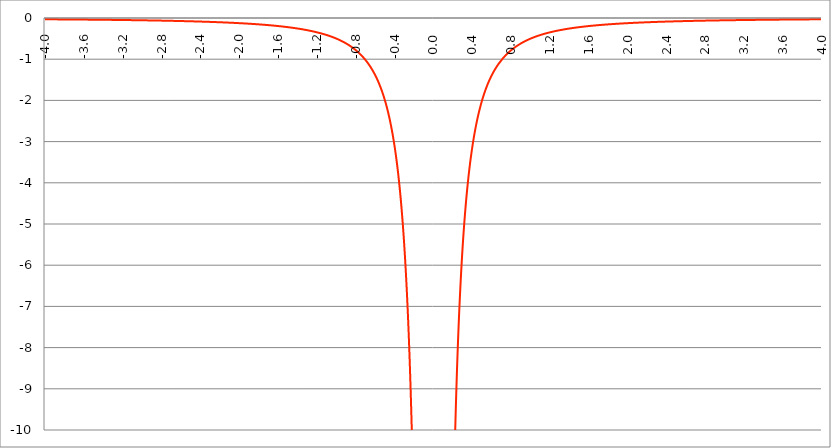
| Category | Series 1 |
|---|---|
| -4.0 | -0.031 |
| -3.996 | -0.031 |
| -3.992 | -0.031 |
| -3.988 | -0.031 |
| -3.984 | -0.032 |
| -3.98 | -0.032 |
| -3.976 | -0.032 |
| -3.972 | -0.032 |
| -3.968 | -0.032 |
| -3.964 | -0.032 |
| -3.96 | -0.032 |
| -3.956 | -0.032 |
| -3.952 | -0.032 |
| -3.948 | -0.032 |
| -3.944 | -0.032 |
| -3.94 | -0.032 |
| -3.936 | -0.032 |
| -3.932 | -0.032 |
| -3.928 | -0.032 |
| -3.924 | -0.032 |
| -3.92 | -0.033 |
| -3.916 | -0.033 |
| -3.912 | -0.033 |
| -3.908 | -0.033 |
| -3.904 | -0.033 |
| -3.9 | -0.033 |
| -3.896 | -0.033 |
| -3.892 | -0.033 |
| -3.888 | -0.033 |
| -3.884 | -0.033 |
| -3.88 | -0.033 |
| -3.876 | -0.033 |
| -3.872 | -0.033 |
| -3.868 | -0.033 |
| -3.864 | -0.033 |
| -3.86 | -0.034 |
| -3.856 | -0.034 |
| -3.852 | -0.034 |
| -3.848 | -0.034 |
| -3.844 | -0.034 |
| -3.84 | -0.034 |
| -3.836 | -0.034 |
| -3.832 | -0.034 |
| -3.828 | -0.034 |
| -3.824 | -0.034 |
| -3.82 | -0.034 |
| -3.816 | -0.034 |
| -3.812 | -0.034 |
| -3.808 | -0.034 |
| -3.804 | -0.035 |
| -3.8 | -0.035 |
| -3.796 | -0.035 |
| -3.792 | -0.035 |
| -3.788 | -0.035 |
| -3.784 | -0.035 |
| -3.78 | -0.035 |
| -3.776 | -0.035 |
| -3.772 | -0.035 |
| -3.768 | -0.035 |
| -3.764 | -0.035 |
| -3.76 | -0.035 |
| -3.756 | -0.035 |
| -3.752 | -0.036 |
| -3.748 | -0.036 |
| -3.744 | -0.036 |
| -3.74 | -0.036 |
| -3.736 | -0.036 |
| -3.732 | -0.036 |
| -3.728 | -0.036 |
| -3.724 | -0.036 |
| -3.72 | -0.036 |
| -3.716 | -0.036 |
| -3.712 | -0.036 |
| -3.708 | -0.036 |
| -3.704 | -0.036 |
| -3.7 | -0.037 |
| -3.696 | -0.037 |
| -3.692 | -0.037 |
| -3.688 | -0.037 |
| -3.684 | -0.037 |
| -3.68 | -0.037 |
| -3.676 | -0.037 |
| -3.672 | -0.037 |
| -3.668 | -0.037 |
| -3.664 | -0.037 |
| -3.66 | -0.037 |
| -3.656 | -0.037 |
| -3.652 | -0.037 |
| -3.648 | -0.038 |
| -3.644 | -0.038 |
| -3.64 | -0.038 |
| -3.636 | -0.038 |
| -3.632 | -0.038 |
| -3.628 | -0.038 |
| -3.624 | -0.038 |
| -3.62 | -0.038 |
| -3.616 | -0.038 |
| -3.612 | -0.038 |
| -3.608 | -0.038 |
| -3.604 | -0.038 |
| -3.6 | -0.039 |
| -3.596 | -0.039 |
| -3.592 | -0.039 |
| -3.588 | -0.039 |
| -3.584 | -0.039 |
| -3.58 | -0.039 |
| -3.576 | -0.039 |
| -3.572 | -0.039 |
| -3.568 | -0.039 |
| -3.564 | -0.039 |
| -3.56 | -0.039 |
| -3.556 | -0.04 |
| -3.552 | -0.04 |
| -3.548 | -0.04 |
| -3.544 | -0.04 |
| -3.54 | -0.04 |
| -3.536 | -0.04 |
| -3.532 | -0.04 |
| -3.528 | -0.04 |
| -3.524 | -0.04 |
| -3.52 | -0.04 |
| -3.516 | -0.04 |
| -3.512 | -0.041 |
| -3.508 | -0.041 |
| -3.504 | -0.041 |
| -3.5 | -0.041 |
| -3.496 | -0.041 |
| -3.492 | -0.041 |
| -3.488 | -0.041 |
| -3.484 | -0.041 |
| -3.48 | -0.041 |
| -3.476 | -0.041 |
| -3.472 | -0.041 |
| -3.467999999999999 | -0.042 |
| -3.463999999999999 | -0.042 |
| -3.459999999999999 | -0.042 |
| -3.455999999999999 | -0.042 |
| -3.451999999999999 | -0.042 |
| -3.447999999999999 | -0.042 |
| -3.443999999999999 | -0.042 |
| -3.439999999999999 | -0.042 |
| -3.435999999999999 | -0.042 |
| -3.431999999999999 | -0.042 |
| -3.427999999999999 | -0.043 |
| -3.423999999999999 | -0.043 |
| -3.419999999999999 | -0.043 |
| -3.415999999999999 | -0.043 |
| -3.411999999999999 | -0.043 |
| -3.407999999999999 | -0.043 |
| -3.403999999999999 | -0.043 |
| -3.399999999999999 | -0.043 |
| -3.395999999999999 | -0.043 |
| -3.391999999999999 | -0.043 |
| -3.387999999999999 | -0.044 |
| -3.383999999999999 | -0.044 |
| -3.379999999999999 | -0.044 |
| -3.375999999999999 | -0.044 |
| -3.371999999999999 | -0.044 |
| -3.367999999999999 | -0.044 |
| -3.363999999999999 | -0.044 |
| -3.359999999999999 | -0.044 |
| -3.355999999999999 | -0.044 |
| -3.351999999999999 | -0.045 |
| -3.347999999999999 | -0.045 |
| -3.343999999999999 | -0.045 |
| -3.339999999999999 | -0.045 |
| -3.335999999999999 | -0.045 |
| -3.331999999999999 | -0.045 |
| -3.327999999999999 | -0.045 |
| -3.323999999999999 | -0.045 |
| -3.319999999999999 | -0.045 |
| -3.315999999999999 | -0.045 |
| -3.311999999999999 | -0.046 |
| -3.307999999999999 | -0.046 |
| -3.303999999999999 | -0.046 |
| -3.299999999999999 | -0.046 |
| -3.295999999999999 | -0.046 |
| -3.291999999999999 | -0.046 |
| -3.288 | -0.046 |
| -3.284 | -0.046 |
| -3.279999999999999 | -0.046 |
| -3.275999999999999 | -0.047 |
| -3.271999999999999 | -0.047 |
| -3.268 | -0.047 |
| -3.264 | -0.047 |
| -3.259999999999999 | -0.047 |
| -3.255999999999999 | -0.047 |
| -3.251999999999999 | -0.047 |
| -3.248 | -0.047 |
| -3.244 | -0.048 |
| -3.239999999999999 | -0.048 |
| -3.235999999999999 | -0.048 |
| -3.231999999999999 | -0.048 |
| -3.228 | -0.048 |
| -3.224 | -0.048 |
| -3.219999999999999 | -0.048 |
| -3.215999999999999 | -0.048 |
| -3.211999999999999 | -0.048 |
| -3.208 | -0.049 |
| -3.204 | -0.049 |
| -3.199999999999999 | -0.049 |
| -3.195999999999999 | -0.049 |
| -3.191999999999999 | -0.049 |
| -3.188 | -0.049 |
| -3.184 | -0.049 |
| -3.179999999999999 | -0.049 |
| -3.175999999999999 | -0.05 |
| -3.171999999999999 | -0.05 |
| -3.168 | -0.05 |
| -3.164 | -0.05 |
| -3.159999999999999 | -0.05 |
| -3.155999999999999 | -0.05 |
| -3.151999999999999 | -0.05 |
| -3.148 | -0.05 |
| -3.144 | -0.051 |
| -3.139999999999999 | -0.051 |
| -3.135999999999999 | -0.051 |
| -3.131999999999999 | -0.051 |
| -3.128 | -0.051 |
| -3.124 | -0.051 |
| -3.119999999999999 | -0.051 |
| -3.115999999999999 | -0.051 |
| -3.111999999999999 | -0.052 |
| -3.108 | -0.052 |
| -3.104 | -0.052 |
| -3.099999999999999 | -0.052 |
| -3.095999999999999 | -0.052 |
| -3.091999999999999 | -0.052 |
| -3.088 | -0.052 |
| -3.084 | -0.053 |
| -3.079999999999999 | -0.053 |
| -3.075999999999999 | -0.053 |
| -3.071999999999999 | -0.053 |
| -3.068 | -0.053 |
| -3.064 | -0.053 |
| -3.059999999999999 | -0.053 |
| -3.055999999999999 | -0.054 |
| -3.051999999999999 | -0.054 |
| -3.048 | -0.054 |
| -3.044 | -0.054 |
| -3.039999999999999 | -0.054 |
| -3.035999999999999 | -0.054 |
| -3.031999999999999 | -0.054 |
| -3.028 | -0.055 |
| -3.024 | -0.055 |
| -3.019999999999999 | -0.055 |
| -3.015999999999999 | -0.055 |
| -3.011999999999999 | -0.055 |
| -3.008 | -0.055 |
| -3.004 | -0.055 |
| -2.999999999999999 | -0.056 |
| -2.995999999999999 | -0.056 |
| -2.991999999999999 | -0.056 |
| -2.988 | -0.056 |
| -2.984 | -0.056 |
| -2.979999999999999 | -0.056 |
| -2.975999999999999 | -0.056 |
| -2.971999999999999 | -0.057 |
| -2.968 | -0.057 |
| -2.964 | -0.057 |
| -2.959999999999999 | -0.057 |
| -2.955999999999999 | -0.057 |
| -2.951999999999999 | -0.057 |
| -2.948 | -0.058 |
| -2.944 | -0.058 |
| -2.939999999999999 | -0.058 |
| -2.935999999999999 | -0.058 |
| -2.931999999999999 | -0.058 |
| -2.928 | -0.058 |
| -2.924 | -0.058 |
| -2.919999999999999 | -0.059 |
| -2.915999999999999 | -0.059 |
| -2.911999999999999 | -0.059 |
| -2.908 | -0.059 |
| -2.904 | -0.059 |
| -2.899999999999999 | -0.059 |
| -2.895999999999999 | -0.06 |
| -2.891999999999999 | -0.06 |
| -2.887999999999999 | -0.06 |
| -2.883999999999999 | -0.06 |
| -2.879999999999999 | -0.06 |
| -2.875999999999999 | -0.06 |
| -2.871999999999999 | -0.061 |
| -2.867999999999999 | -0.061 |
| -2.863999999999999 | -0.061 |
| -2.859999999999999 | -0.061 |
| -2.855999999999999 | -0.061 |
| -2.851999999999999 | -0.061 |
| -2.847999999999999 | -0.062 |
| -2.843999999999999 | -0.062 |
| -2.839999999999999 | -0.062 |
| -2.835999999999999 | -0.062 |
| -2.831999999999999 | -0.062 |
| -2.827999999999999 | -0.063 |
| -2.823999999999999 | -0.063 |
| -2.819999999999999 | -0.063 |
| -2.815999999999999 | -0.063 |
| -2.811999999999999 | -0.063 |
| -2.807999999999999 | -0.063 |
| -2.803999999999999 | -0.064 |
| -2.799999999999999 | -0.064 |
| -2.795999999999999 | -0.064 |
| -2.791999999999999 | -0.064 |
| -2.787999999999999 | -0.064 |
| -2.783999999999999 | -0.065 |
| -2.779999999999999 | -0.065 |
| -2.775999999999999 | -0.065 |
| -2.771999999999999 | -0.065 |
| -2.767999999999999 | -0.065 |
| -2.763999999999999 | -0.065 |
| -2.759999999999999 | -0.066 |
| -2.755999999999999 | -0.066 |
| -2.751999999999999 | -0.066 |
| -2.747999999999999 | -0.066 |
| -2.743999999999999 | -0.066 |
| -2.739999999999999 | -0.067 |
| -2.735999999999999 | -0.067 |
| -2.731999999999999 | -0.067 |
| -2.727999999999999 | -0.067 |
| -2.723999999999999 | -0.067 |
| -2.719999999999999 | -0.068 |
| -2.715999999999999 | -0.068 |
| -2.711999999999999 | -0.068 |
| -2.707999999999999 | -0.068 |
| -2.703999999999999 | -0.068 |
| -2.699999999999999 | -0.069 |
| -2.695999999999999 | -0.069 |
| -2.691999999999999 | -0.069 |
| -2.687999999999999 | -0.069 |
| -2.683999999999999 | -0.069 |
| -2.679999999999999 | -0.07 |
| -2.675999999999999 | -0.07 |
| -2.671999999999999 | -0.07 |
| -2.667999999999999 | -0.07 |
| -2.663999999999999 | -0.07 |
| -2.659999999999999 | -0.071 |
| -2.655999999999999 | -0.071 |
| -2.651999999999999 | -0.071 |
| -2.647999999999999 | -0.071 |
| -2.643999999999999 | -0.072 |
| -2.639999999999999 | -0.072 |
| -2.635999999999999 | -0.072 |
| -2.631999999999999 | -0.072 |
| -2.627999999999999 | -0.072 |
| -2.623999999999999 | -0.073 |
| -2.619999999999999 | -0.073 |
| -2.615999999999999 | -0.073 |
| -2.611999999999999 | -0.073 |
| -2.607999999999999 | -0.074 |
| -2.603999999999999 | -0.074 |
| -2.599999999999999 | -0.074 |
| -2.595999999999999 | -0.074 |
| -2.591999999999999 | -0.074 |
| -2.587999999999999 | -0.075 |
| -2.583999999999999 | -0.075 |
| -2.579999999999999 | -0.075 |
| -2.575999999999999 | -0.075 |
| -2.571999999999999 | -0.076 |
| -2.567999999999999 | -0.076 |
| -2.563999999999999 | -0.076 |
| -2.559999999999999 | -0.076 |
| -2.555999999999999 | -0.077 |
| -2.551999999999999 | -0.077 |
| -2.547999999999999 | -0.077 |
| -2.543999999999999 | -0.077 |
| -2.539999999999999 | -0.078 |
| -2.535999999999999 | -0.078 |
| -2.531999999999999 | -0.078 |
| -2.527999999999999 | -0.078 |
| -2.523999999999999 | -0.078 |
| -2.519999999999999 | -0.079 |
| -2.515999999999999 | -0.079 |
| -2.511999999999999 | -0.079 |
| -2.507999999999999 | -0.079 |
| -2.503999999999999 | -0.08 |
| -2.499999999999999 | -0.08 |
| -2.495999999999999 | -0.08 |
| -2.491999999999999 | -0.081 |
| -2.487999999999999 | -0.081 |
| -2.483999999999999 | -0.081 |
| -2.479999999999999 | -0.081 |
| -2.475999999999999 | -0.082 |
| -2.471999999999999 | -0.082 |
| -2.467999999999999 | -0.082 |
| -2.463999999999999 | -0.082 |
| -2.459999999999999 | -0.083 |
| -2.455999999999999 | -0.083 |
| -2.451999999999999 | -0.083 |
| -2.447999999999999 | -0.083 |
| -2.443999999999999 | -0.084 |
| -2.439999999999999 | -0.084 |
| -2.435999999999999 | -0.084 |
| -2.431999999999999 | -0.085 |
| -2.427999999999999 | -0.085 |
| -2.423999999999999 | -0.085 |
| -2.419999999999999 | -0.085 |
| -2.415999999999999 | -0.086 |
| -2.411999999999999 | -0.086 |
| -2.407999999999999 | -0.086 |
| -2.403999999999999 | -0.087 |
| -2.399999999999999 | -0.087 |
| -2.395999999999999 | -0.087 |
| -2.391999999999999 | -0.087 |
| -2.387999999999999 | -0.088 |
| -2.383999999999999 | -0.088 |
| -2.379999999999999 | -0.088 |
| -2.375999999999999 | -0.089 |
| -2.371999999999999 | -0.089 |
| -2.367999999999998 | -0.089 |
| -2.363999999999998 | -0.089 |
| -2.359999999999998 | -0.09 |
| -2.355999999999998 | -0.09 |
| -2.351999999999998 | -0.09 |
| -2.347999999999998 | -0.091 |
| -2.343999999999998 | -0.091 |
| -2.339999999999998 | -0.091 |
| -2.335999999999998 | -0.092 |
| -2.331999999999998 | -0.092 |
| -2.327999999999998 | -0.092 |
| -2.323999999999998 | -0.093 |
| -2.319999999999998 | -0.093 |
| -2.315999999999998 | -0.093 |
| -2.311999999999998 | -0.094 |
| -2.307999999999998 | -0.094 |
| -2.303999999999998 | -0.094 |
| -2.299999999999998 | -0.095 |
| -2.295999999999998 | -0.095 |
| -2.291999999999998 | -0.095 |
| -2.287999999999998 | -0.096 |
| -2.283999999999998 | -0.096 |
| -2.279999999999998 | -0.096 |
| -2.275999999999998 | -0.097 |
| -2.271999999999998 | -0.097 |
| -2.267999999999998 | -0.097 |
| -2.263999999999998 | -0.098 |
| -2.259999999999998 | -0.098 |
| -2.255999999999998 | -0.098 |
| -2.251999999999998 | -0.099 |
| -2.247999999999998 | -0.099 |
| -2.243999999999998 | -0.099 |
| -2.239999999999998 | -0.1 |
| -2.235999999999998 | -0.1 |
| -2.231999999999998 | -0.1 |
| -2.227999999999998 | -0.101 |
| -2.223999999999998 | -0.101 |
| -2.219999999999998 | -0.101 |
| -2.215999999999998 | -0.102 |
| -2.211999999999998 | -0.102 |
| -2.207999999999998 | -0.103 |
| -2.203999999999998 | -0.103 |
| -2.199999999999998 | -0.103 |
| -2.195999999999998 | -0.104 |
| -2.191999999999998 | -0.104 |
| -2.187999999999998 | -0.104 |
| -2.183999999999998 | -0.105 |
| -2.179999999999998 | -0.105 |
| -2.175999999999998 | -0.106 |
| -2.171999999999998 | -0.106 |
| -2.167999999999998 | -0.106 |
| -2.163999999999998 | -0.107 |
| -2.159999999999998 | -0.107 |
| -2.155999999999998 | -0.108 |
| -2.151999999999998 | -0.108 |
| -2.147999999999998 | -0.108 |
| -2.143999999999998 | -0.109 |
| -2.139999999999998 | -0.109 |
| -2.135999999999998 | -0.11 |
| -2.131999999999998 | -0.11 |
| -2.127999999999998 | -0.11 |
| -2.123999999999998 | -0.111 |
| -2.119999999999998 | -0.111 |
| -2.115999999999998 | -0.112 |
| -2.111999999999998 | -0.112 |
| -2.107999999999998 | -0.113 |
| -2.103999999999998 | -0.113 |
| -2.099999999999998 | -0.113 |
| -2.095999999999998 | -0.114 |
| -2.091999999999998 | -0.114 |
| -2.087999999999998 | -0.115 |
| -2.083999999999998 | -0.115 |
| -2.079999999999998 | -0.116 |
| -2.075999999999998 | -0.116 |
| -2.071999999999998 | -0.116 |
| -2.067999999999998 | -0.117 |
| -2.063999999999998 | -0.117 |
| -2.059999999999998 | -0.118 |
| -2.055999999999998 | -0.118 |
| -2.051999999999998 | -0.119 |
| -2.047999999999998 | -0.119 |
| -2.043999999999998 | -0.12 |
| -2.039999999999998 | -0.12 |
| -2.035999999999998 | -0.121 |
| -2.031999999999998 | -0.121 |
| -2.027999999999998 | -0.122 |
| -2.023999999999998 | -0.122 |
| -2.019999999999998 | -0.123 |
| -2.015999999999998 | -0.123 |
| -2.011999999999998 | -0.124 |
| -2.007999999999998 | -0.124 |
| -2.003999999999998 | -0.125 |
| -1.999999999999998 | -0.125 |
| -1.995999999999998 | -0.126 |
| -1.991999999999998 | -0.126 |
| -1.987999999999998 | -0.127 |
| -1.983999999999998 | -0.127 |
| -1.979999999999998 | -0.128 |
| -1.975999999999998 | -0.128 |
| -1.971999999999998 | -0.129 |
| -1.967999999999998 | -0.129 |
| -1.963999999999998 | -0.13 |
| -1.959999999999998 | -0.13 |
| -1.955999999999998 | -0.131 |
| -1.951999999999998 | -0.131 |
| -1.947999999999998 | -0.132 |
| -1.943999999999998 | -0.132 |
| -1.939999999999998 | -0.133 |
| -1.935999999999998 | -0.133 |
| -1.931999999999998 | -0.134 |
| -1.927999999999998 | -0.135 |
| -1.923999999999998 | -0.135 |
| -1.919999999999998 | -0.136 |
| -1.915999999999998 | -0.136 |
| -1.911999999999998 | -0.137 |
| -1.907999999999998 | -0.137 |
| -1.903999999999998 | -0.138 |
| -1.899999999999998 | -0.139 |
| -1.895999999999998 | -0.139 |
| -1.891999999999998 | -0.14 |
| -1.887999999999998 | -0.14 |
| -1.883999999999998 | -0.141 |
| -1.879999999999998 | -0.141 |
| -1.875999999999998 | -0.142 |
| -1.871999999999998 | -0.143 |
| -1.867999999999998 | -0.143 |
| -1.863999999999998 | -0.144 |
| -1.859999999999998 | -0.145 |
| -1.855999999999998 | -0.145 |
| -1.851999999999998 | -0.146 |
| -1.847999999999998 | -0.146 |
| -1.843999999999998 | -0.147 |
| -1.839999999999998 | -0.148 |
| -1.835999999999998 | -0.148 |
| -1.831999999999998 | -0.149 |
| -1.827999999999998 | -0.15 |
| -1.823999999999998 | -0.15 |
| -1.819999999999998 | -0.151 |
| -1.815999999999998 | -0.152 |
| -1.811999999999998 | -0.152 |
| -1.807999999999998 | -0.153 |
| -1.803999999999998 | -0.154 |
| -1.799999999999998 | -0.154 |
| -1.795999999999998 | -0.155 |
| -1.791999999999998 | -0.156 |
| -1.787999999999998 | -0.156 |
| -1.783999999999998 | -0.157 |
| -1.779999999999998 | -0.158 |
| -1.775999999999998 | -0.159 |
| -1.771999999999998 | -0.159 |
| -1.767999999999998 | -0.16 |
| -1.763999999999998 | -0.161 |
| -1.759999999999998 | -0.161 |
| -1.755999999999998 | -0.162 |
| -1.751999999999998 | -0.163 |
| -1.747999999999998 | -0.164 |
| -1.743999999999998 | -0.164 |
| -1.739999999999998 | -0.165 |
| -1.735999999999998 | -0.166 |
| -1.731999999999998 | -0.167 |
| -1.727999999999998 | -0.167 |
| -1.723999999999998 | -0.168 |
| -1.719999999999998 | -0.169 |
| -1.715999999999998 | -0.17 |
| -1.711999999999998 | -0.171 |
| -1.707999999999998 | -0.171 |
| -1.703999999999998 | -0.172 |
| -1.699999999999998 | -0.173 |
| -1.695999999999998 | -0.174 |
| -1.691999999999998 | -0.175 |
| -1.687999999999998 | -0.175 |
| -1.683999999999998 | -0.176 |
| -1.679999999999998 | -0.177 |
| -1.675999999999998 | -0.178 |
| -1.671999999999998 | -0.179 |
| -1.667999999999998 | -0.18 |
| -1.663999999999998 | -0.181 |
| -1.659999999999998 | -0.181 |
| -1.655999999999998 | -0.182 |
| -1.651999999999998 | -0.183 |
| -1.647999999999998 | -0.184 |
| -1.643999999999998 | -0.185 |
| -1.639999999999998 | -0.186 |
| -1.635999999999998 | -0.187 |
| -1.631999999999998 | -0.188 |
| -1.627999999999998 | -0.189 |
| -1.623999999999998 | -0.19 |
| -1.619999999999998 | -0.191 |
| -1.615999999999998 | -0.191 |
| -1.611999999999998 | -0.192 |
| -1.607999999999998 | -0.193 |
| -1.603999999999998 | -0.194 |
| -1.599999999999998 | -0.195 |
| -1.595999999999998 | -0.196 |
| -1.591999999999998 | -0.197 |
| -1.587999999999998 | -0.198 |
| -1.583999999999998 | -0.199 |
| -1.579999999999998 | -0.2 |
| -1.575999999999998 | -0.201 |
| -1.571999999999998 | -0.202 |
| -1.567999999999998 | -0.203 |
| -1.563999999999998 | -0.204 |
| -1.559999999999998 | -0.205 |
| -1.555999999999998 | -0.207 |
| -1.551999999999998 | -0.208 |
| -1.547999999999998 | -0.209 |
| -1.543999999999998 | -0.21 |
| -1.539999999999998 | -0.211 |
| -1.535999999999998 | -0.212 |
| -1.531999999999998 | -0.213 |
| -1.527999999999998 | -0.214 |
| -1.523999999999998 | -0.215 |
| -1.519999999999998 | -0.216 |
| -1.515999999999998 | -0.218 |
| -1.511999999999998 | -0.219 |
| -1.507999999999998 | -0.22 |
| -1.503999999999998 | -0.221 |
| -1.499999999999998 | -0.222 |
| -1.495999999999998 | -0.223 |
| -1.491999999999998 | -0.225 |
| -1.487999999999998 | -0.226 |
| -1.483999999999998 | -0.227 |
| -1.479999999999998 | -0.228 |
| -1.475999999999998 | -0.23 |
| -1.471999999999998 | -0.231 |
| -1.467999999999998 | -0.232 |
| -1.463999999999998 | -0.233 |
| -1.459999999999998 | -0.235 |
| -1.455999999999998 | -0.236 |
| -1.451999999999998 | -0.237 |
| -1.447999999999998 | -0.238 |
| -1.443999999999998 | -0.24 |
| -1.439999999999998 | -0.241 |
| -1.435999999999998 | -0.242 |
| -1.431999999999998 | -0.244 |
| -1.427999999999998 | -0.245 |
| -1.423999999999998 | -0.247 |
| -1.419999999999998 | -0.248 |
| -1.415999999999998 | -0.249 |
| -1.411999999999998 | -0.251 |
| -1.407999999999998 | -0.252 |
| -1.403999999999998 | -0.254 |
| -1.399999999999998 | -0.255 |
| -1.395999999999998 | -0.257 |
| -1.391999999999998 | -0.258 |
| -1.387999999999998 | -0.26 |
| -1.383999999999998 | -0.261 |
| -1.379999999999998 | -0.263 |
| -1.375999999999998 | -0.264 |
| -1.371999999999998 | -0.266 |
| -1.367999999999998 | -0.267 |
| -1.363999999999998 | -0.269 |
| -1.359999999999998 | -0.27 |
| -1.355999999999998 | -0.272 |
| -1.351999999999998 | -0.274 |
| -1.347999999999998 | -0.275 |
| -1.343999999999998 | -0.277 |
| -1.339999999999998 | -0.278 |
| -1.335999999999998 | -0.28 |
| -1.331999999999998 | -0.282 |
| -1.327999999999998 | -0.284 |
| -1.323999999999998 | -0.285 |
| -1.319999999999998 | -0.287 |
| -1.315999999999998 | -0.289 |
| -1.311999999999998 | -0.29 |
| -1.307999999999998 | -0.292 |
| -1.303999999999998 | -0.294 |
| -1.299999999999998 | -0.296 |
| -1.295999999999998 | -0.298 |
| -1.291999999999998 | -0.3 |
| -1.287999999999998 | -0.301 |
| -1.283999999999998 | -0.303 |
| -1.279999999999998 | -0.305 |
| -1.275999999999998 | -0.307 |
| -1.271999999999998 | -0.309 |
| -1.267999999999998 | -0.311 |
| -1.263999999999998 | -0.313 |
| -1.259999999999998 | -0.315 |
| -1.255999999999998 | -0.317 |
| -1.251999999999998 | -0.319 |
| -1.247999999999998 | -0.321 |
| -1.243999999999998 | -0.323 |
| -1.239999999999998 | -0.325 |
| -1.235999999999998 | -0.327 |
| -1.231999999999998 | -0.329 |
| -1.227999999999998 | -0.332 |
| -1.223999999999998 | -0.334 |
| -1.219999999999998 | -0.336 |
| -1.215999999999998 | -0.338 |
| -1.211999999999998 | -0.34 |
| -1.207999999999998 | -0.343 |
| -1.203999999999998 | -0.345 |
| -1.199999999999997 | -0.347 |
| -1.195999999999997 | -0.35 |
| -1.191999999999997 | -0.352 |
| -1.187999999999997 | -0.354 |
| -1.183999999999997 | -0.357 |
| -1.179999999999997 | -0.359 |
| -1.175999999999997 | -0.362 |
| -1.171999999999997 | -0.364 |
| -1.167999999999997 | -0.367 |
| -1.163999999999997 | -0.369 |
| -1.159999999999997 | -0.372 |
| -1.155999999999997 | -0.374 |
| -1.151999999999997 | -0.377 |
| -1.147999999999997 | -0.379 |
| -1.143999999999997 | -0.382 |
| -1.139999999999997 | -0.385 |
| -1.135999999999997 | -0.387 |
| -1.131999999999997 | -0.39 |
| -1.127999999999997 | -0.393 |
| -1.123999999999997 | -0.396 |
| -1.119999999999997 | -0.399 |
| -1.115999999999997 | -0.401 |
| -1.111999999999997 | -0.404 |
| -1.107999999999997 | -0.407 |
| -1.103999999999997 | -0.41 |
| -1.099999999999997 | -0.413 |
| -1.095999999999997 | -0.416 |
| -1.091999999999997 | -0.419 |
| -1.087999999999997 | -0.422 |
| -1.083999999999997 | -0.426 |
| -1.079999999999997 | -0.429 |
| -1.075999999999997 | -0.432 |
| -1.071999999999997 | -0.435 |
| -1.067999999999997 | -0.438 |
| -1.063999999999997 | -0.442 |
| -1.059999999999997 | -0.445 |
| -1.055999999999997 | -0.448 |
| -1.051999999999997 | -0.452 |
| -1.047999999999997 | -0.455 |
| -1.043999999999997 | -0.459 |
| -1.039999999999997 | -0.462 |
| -1.035999999999997 | -0.466 |
| -1.031999999999997 | -0.469 |
| -1.027999999999997 | -0.473 |
| -1.023999999999997 | -0.477 |
| -1.019999999999997 | -0.481 |
| -1.015999999999997 | -0.484 |
| -1.011999999999997 | -0.488 |
| -1.007999999999997 | -0.492 |
| -1.003999999999997 | -0.496 |
| -0.999999999999997 | -0.5 |
| -0.995999999999997 | -0.504 |
| -0.991999999999997 | -0.508 |
| -0.987999999999997 | -0.512 |
| -0.983999999999997 | -0.516 |
| -0.979999999999997 | -0.521 |
| -0.975999999999997 | -0.525 |
| -0.971999999999997 | -0.529 |
| -0.967999999999997 | -0.534 |
| -0.963999999999997 | -0.538 |
| -0.959999999999997 | -0.543 |
| -0.955999999999997 | -0.547 |
| -0.951999999999997 | -0.552 |
| -0.947999999999997 | -0.556 |
| -0.943999999999997 | -0.561 |
| -0.939999999999997 | -0.566 |
| -0.935999999999997 | -0.571 |
| -0.931999999999997 | -0.576 |
| -0.927999999999997 | -0.581 |
| -0.923999999999997 | -0.586 |
| -0.919999999999997 | -0.591 |
| -0.915999999999997 | -0.596 |
| -0.911999999999997 | -0.601 |
| -0.907999999999997 | -0.606 |
| -0.903999999999997 | -0.612 |
| -0.899999999999997 | -0.617 |
| -0.895999999999997 | -0.623 |
| -0.891999999999997 | -0.628 |
| -0.887999999999997 | -0.634 |
| -0.883999999999997 | -0.64 |
| -0.879999999999997 | -0.646 |
| -0.875999999999997 | -0.652 |
| -0.871999999999997 | -0.658 |
| -0.867999999999997 | -0.664 |
| -0.863999999999997 | -0.67 |
| -0.859999999999997 | -0.676 |
| -0.855999999999997 | -0.682 |
| -0.851999999999997 | -0.689 |
| -0.847999999999997 | -0.695 |
| -0.843999999999997 | -0.702 |
| -0.839999999999997 | -0.709 |
| -0.835999999999997 | -0.715 |
| -0.831999999999997 | -0.722 |
| -0.827999999999997 | -0.729 |
| -0.823999999999997 | -0.736 |
| -0.819999999999997 | -0.744 |
| -0.815999999999997 | -0.751 |
| -0.811999999999997 | -0.758 |
| -0.807999999999997 | -0.766 |
| -0.803999999999997 | -0.773 |
| -0.799999999999997 | -0.781 |
| -0.795999999999997 | -0.789 |
| -0.791999999999997 | -0.797 |
| -0.787999999999997 | -0.805 |
| -0.783999999999997 | -0.813 |
| -0.779999999999997 | -0.822 |
| -0.775999999999997 | -0.83 |
| -0.771999999999997 | -0.839 |
| -0.767999999999997 | -0.848 |
| -0.763999999999997 | -0.857 |
| -0.759999999999997 | -0.866 |
| -0.755999999999997 | -0.875 |
| -0.751999999999997 | -0.884 |
| -0.747999999999997 | -0.894 |
| -0.743999999999997 | -0.903 |
| -0.739999999999997 | -0.913 |
| -0.735999999999997 | -0.923 |
| -0.731999999999997 | -0.933 |
| -0.727999999999997 | -0.943 |
| -0.723999999999997 | -0.954 |
| -0.719999999999997 | -0.965 |
| -0.715999999999997 | -0.975 |
| -0.711999999999997 | -0.986 |
| -0.707999999999997 | -0.997 |
| -0.703999999999997 | -1.009 |
| -0.699999999999997 | -1.02 |
| -0.695999999999997 | -1.032 |
| -0.691999999999997 | -1.044 |
| -0.687999999999997 | -1.056 |
| -0.683999999999997 | -1.069 |
| -0.679999999999997 | -1.081 |
| -0.675999999999997 | -1.094 |
| -0.671999999999997 | -1.107 |
| -0.667999999999997 | -1.121 |
| -0.663999999999997 | -1.134 |
| -0.659999999999997 | -1.148 |
| -0.655999999999997 | -1.162 |
| -0.651999999999997 | -1.176 |
| -0.647999999999997 | -1.191 |
| -0.643999999999997 | -1.206 |
| -0.639999999999997 | -1.221 |
| -0.635999999999997 | -1.236 |
| -0.631999999999997 | -1.252 |
| -0.627999999999997 | -1.268 |
| -0.623999999999997 | -1.284 |
| -0.619999999999997 | -1.301 |
| -0.615999999999997 | -1.318 |
| -0.611999999999997 | -1.335 |
| -0.607999999999997 | -1.353 |
| -0.603999999999997 | -1.371 |
| -0.599999999999997 | -1.389 |
| -0.595999999999997 | -1.408 |
| -0.591999999999997 | -1.427 |
| -0.587999999999997 | -1.446 |
| -0.583999999999997 | -1.466 |
| -0.579999999999997 | -1.486 |
| -0.575999999999997 | -1.507 |
| -0.571999999999997 | -1.528 |
| -0.567999999999997 | -1.55 |
| -0.563999999999997 | -1.572 |
| -0.559999999999997 | -1.594 |
| -0.555999999999997 | -1.617 |
| -0.551999999999997 | -1.641 |
| -0.547999999999997 | -1.665 |
| -0.543999999999997 | -1.69 |
| -0.539999999999997 | -1.715 |
| -0.535999999999997 | -1.74 |
| -0.531999999999997 | -1.767 |
| -0.527999999999997 | -1.794 |
| -0.523999999999997 | -1.821 |
| -0.519999999999997 | -1.849 |
| -0.515999999999997 | -1.878 |
| -0.511999999999997 | -1.907 |
| -0.507999999999997 | -1.938 |
| -0.503999999999997 | -1.968 |
| -0.499999999999997 | -2 |
| -0.495999999999997 | -2.032 |
| -0.491999999999997 | -2.066 |
| -0.487999999999997 | -2.1 |
| -0.483999999999997 | -2.134 |
| -0.479999999999997 | -2.17 |
| -0.475999999999997 | -2.207 |
| -0.471999999999997 | -2.244 |
| -0.467999999999997 | -2.283 |
| -0.463999999999997 | -2.322 |
| -0.459999999999997 | -2.363 |
| -0.455999999999997 | -2.405 |
| -0.451999999999997 | -2.447 |
| -0.447999999999997 | -2.491 |
| -0.443999999999997 | -2.536 |
| -0.439999999999997 | -2.583 |
| -0.435999999999997 | -2.63 |
| -0.431999999999997 | -2.679 |
| -0.427999999999997 | -2.729 |
| -0.423999999999997 | -2.781 |
| -0.419999999999997 | -2.834 |
| -0.415999999999997 | -2.889 |
| -0.411999999999997 | -2.946 |
| -0.407999999999997 | -3.004 |
| -0.403999999999997 | -3.063 |
| -0.399999999999997 | -3.125 |
| -0.395999999999997 | -3.188 |
| -0.391999999999997 | -3.254 |
| -0.387999999999997 | -3.321 |
| -0.383999999999997 | -3.391 |
| -0.379999999999997 | -3.463 |
| -0.375999999999997 | -3.537 |
| -0.371999999999997 | -3.613 |
| -0.367999999999997 | -3.692 |
| -0.363999999999997 | -3.774 |
| -0.359999999999997 | -3.858 |
| -0.355999999999997 | -3.945 |
| -0.351999999999997 | -4.035 |
| -0.347999999999997 | -4.129 |
| -0.343999999999997 | -4.225 |
| -0.339999999999997 | -4.325 |
| -0.335999999999997 | -4.429 |
| -0.331999999999997 | -4.536 |
| -0.327999999999997 | -4.648 |
| -0.323999999999997 | -4.763 |
| -0.319999999999997 | -4.883 |
| -0.315999999999997 | -5.007 |
| -0.311999999999997 | -5.136 |
| -0.307999999999997 | -5.271 |
| -0.303999999999997 | -5.41 |
| -0.299999999999997 | -5.556 |
| -0.295999999999997 | -5.707 |
| -0.291999999999997 | -5.864 |
| -0.287999999999997 | -6.028 |
| -0.283999999999997 | -6.199 |
| -0.279999999999997 | -6.378 |
| -0.275999999999997 | -6.564 |
| -0.271999999999997 | -6.758 |
| -0.267999999999997 | -6.961 |
| -0.263999999999997 | -7.174 |
| -0.259999999999997 | -7.396 |
| -0.255999999999997 | -7.629 |
| -0.251999999999997 | -7.874 |
| -0.247999999999997 | -8.13 |
| -0.243999999999997 | -8.398 |
| -0.239999999999997 | -8.681 |
| -0.235999999999997 | -8.977 |
| -0.231999999999997 | -9.29 |
| -0.227999999999997 | -9.618 |
| -0.223999999999997 | -9.965 |
| -0.219999999999997 | -10.331 |
| -0.215999999999997 | -10.717 |
| -0.211999999999997 | -11.125 |
| -0.207999999999997 | -11.557 |
| -0.203999999999997 | -12.015 |
| -0.199999999999997 | -12.5 |
| -0.195999999999997 | -13.015 |
| -0.191999999999997 | -13.563 |
| -0.187999999999997 | -14.147 |
| -0.183999999999997 | -14.768 |
| -0.179999999999997 | -15.432 |
| -0.175999999999997 | -16.142 |
| -0.171999999999997 | -16.901 |
| -0.167999999999997 | -17.715 |
| -0.163999999999997 | -18.59 |
| -0.159999999999997 | -19.531 |
| -0.155999999999997 | -20.546 |
| -0.151999999999997 | -21.641 |
| -0.147999999999997 | -22.827 |
| -0.143999999999997 | -24.113 |
| -0.139999999999997 | -25.51 |
| -0.135999999999997 | -27.033 |
| -0.131999999999997 | -28.696 |
| -0.127999999999997 | -30.518 |
| -0.123999999999997 | -32.518 |
| -0.119999999999997 | -34.722 |
| -0.115999999999997 | -37.158 |
| -0.111999999999997 | -39.86 |
| -0.107999999999997 | -42.867 |
| -0.103999999999997 | -46.228 |
| -0.0999999999999965 | -50 |
| -0.0959999999999965 | -54.253 |
| -0.0919999999999965 | -59.074 |
| -0.0879999999999965 | -64.566 |
| -0.0839999999999965 | -70.862 |
| -0.0799999999999965 | -78.125 |
| -0.0759999999999965 | -86.565 |
| -0.0719999999999965 | -96.451 |
| -0.0679999999999965 | -108.131 |
| -0.0639999999999965 | -122.07 |
| -0.0599999999999965 | -138.889 |
| -0.0559999999999965 | -159.439 |
| -0.0519999999999965 | -184.911 |
| -0.0479999999999965 | -217.014 |
| -0.0439999999999965 | -258.264 |
| -0.0399999999999965 | -312.5 |
| -0.0359999999999965 | -385.802 |
| -0.0319999999999965 | -488.281 |
| -0.0279999999999965 | -637.755 |
| -0.0239999999999965 | -868.056 |
| -0.0199999999999965 | -1250 |
| -0.0159999999999965 | -1953.125 |
| -0.0119999999999965 | -3472.222 |
| -0.00799999999999647 | -7812.5 |
| -0.00399999999999647 | -31250 |
| 3.52495810318487e-15 | -40240381134407204332632014848 |
| 0.00400000000000352 | -31250 |
| 0.00800000000000352 | -7812.5 |
| 0.0120000000000035 | -3472.222 |
| 0.0160000000000035 | -1953.125 |
| 0.0200000000000035 | -1250 |
| 0.0240000000000035 | -868.056 |
| 0.0280000000000035 | -637.755 |
| 0.0320000000000035 | -488.281 |
| 0.0360000000000035 | -385.802 |
| 0.0400000000000035 | -312.5 |
| 0.0440000000000035 | -258.264 |
| 0.0480000000000035 | -217.014 |
| 0.0520000000000035 | -184.911 |
| 0.0560000000000035 | -159.439 |
| 0.0600000000000035 | -138.889 |
| 0.0640000000000035 | -122.07 |
| 0.0680000000000035 | -108.131 |
| 0.0720000000000036 | -96.451 |
| 0.0760000000000036 | -86.565 |
| 0.0800000000000036 | -78.125 |
| 0.0840000000000036 | -70.862 |
| 0.0880000000000036 | -64.566 |
| 0.0920000000000036 | -59.074 |
| 0.0960000000000036 | -54.253 |
| 0.100000000000004 | -50 |
| 0.104000000000004 | -46.228 |
| 0.108000000000004 | -42.867 |
| 0.112000000000004 | -39.86 |
| 0.116000000000004 | -37.158 |
| 0.120000000000004 | -34.722 |
| 0.124000000000004 | -32.518 |
| 0.128000000000004 | -30.518 |
| 0.132000000000004 | -28.696 |
| 0.136000000000004 | -27.033 |
| 0.140000000000004 | -25.51 |
| 0.144000000000004 | -24.113 |
| 0.148000000000004 | -22.827 |
| 0.152000000000004 | -21.641 |
| 0.156000000000004 | -20.546 |
| 0.160000000000004 | -19.531 |
| 0.164000000000004 | -18.59 |
| 0.168000000000004 | -17.715 |
| 0.172000000000004 | -16.901 |
| 0.176000000000004 | -16.142 |
| 0.180000000000004 | -15.432 |
| 0.184000000000004 | -14.768 |
| 0.188000000000004 | -14.147 |
| 0.192000000000004 | -13.563 |
| 0.196000000000004 | -13.015 |
| 0.200000000000004 | -12.5 |
| 0.204000000000004 | -12.015 |
| 0.208000000000004 | -11.557 |
| 0.212000000000004 | -11.125 |
| 0.216000000000004 | -10.717 |
| 0.220000000000004 | -10.331 |
| 0.224000000000004 | -9.965 |
| 0.228000000000004 | -9.618 |
| 0.232000000000004 | -9.29 |
| 0.236000000000004 | -8.977 |
| 0.240000000000004 | -8.681 |
| 0.244000000000004 | -8.398 |
| 0.248000000000004 | -8.13 |
| 0.252000000000004 | -7.874 |
| 0.256000000000004 | -7.629 |
| 0.260000000000004 | -7.396 |
| 0.264000000000004 | -7.174 |
| 0.268000000000004 | -6.961 |
| 0.272000000000004 | -6.758 |
| 0.276000000000004 | -6.564 |
| 0.280000000000004 | -6.378 |
| 0.284000000000004 | -6.199 |
| 0.288000000000004 | -6.028 |
| 0.292000000000004 | -5.864 |
| 0.296000000000004 | -5.707 |
| 0.300000000000004 | -5.556 |
| 0.304000000000004 | -5.41 |
| 0.308000000000004 | -5.271 |
| 0.312000000000004 | -5.136 |
| 0.316000000000004 | -5.007 |
| 0.320000000000004 | -4.883 |
| 0.324000000000004 | -4.763 |
| 0.328000000000004 | -4.648 |
| 0.332000000000004 | -4.536 |
| 0.336000000000004 | -4.429 |
| 0.340000000000004 | -4.325 |
| 0.344000000000004 | -4.225 |
| 0.348000000000004 | -4.129 |
| 0.352000000000004 | -4.035 |
| 0.356000000000004 | -3.945 |
| 0.360000000000004 | -3.858 |
| 0.364000000000004 | -3.774 |
| 0.368000000000004 | -3.692 |
| 0.372000000000004 | -3.613 |
| 0.376000000000004 | -3.537 |
| 0.380000000000004 | -3.463 |
| 0.384000000000004 | -3.391 |
| 0.388000000000004 | -3.321 |
| 0.392000000000004 | -3.254 |
| 0.396000000000004 | -3.188 |
| 0.400000000000004 | -3.125 |
| 0.404000000000004 | -3.063 |
| 0.408000000000004 | -3.004 |
| 0.412000000000004 | -2.946 |
| 0.416000000000004 | -2.889 |
| 0.420000000000004 | -2.834 |
| 0.424000000000004 | -2.781 |
| 0.428000000000004 | -2.729 |
| 0.432000000000004 | -2.679 |
| 0.436000000000004 | -2.63 |
| 0.440000000000004 | -2.583 |
| 0.444000000000004 | -2.536 |
| 0.448000000000004 | -2.491 |
| 0.452000000000004 | -2.447 |
| 0.456000000000004 | -2.405 |
| 0.460000000000004 | -2.363 |
| 0.464000000000004 | -2.322 |
| 0.468000000000004 | -2.283 |
| 0.472000000000004 | -2.244 |
| 0.476000000000004 | -2.207 |
| 0.480000000000004 | -2.17 |
| 0.484000000000004 | -2.134 |
| 0.488000000000004 | -2.1 |
| 0.492000000000004 | -2.066 |
| 0.496000000000004 | -2.032 |
| 0.500000000000004 | -2 |
| 0.504000000000004 | -1.968 |
| 0.508000000000004 | -1.938 |
| 0.512000000000004 | -1.907 |
| 0.516000000000004 | -1.878 |
| 0.520000000000004 | -1.849 |
| 0.524000000000004 | -1.821 |
| 0.528000000000004 | -1.794 |
| 0.532000000000004 | -1.767 |
| 0.536000000000004 | -1.74 |
| 0.540000000000004 | -1.715 |
| 0.544000000000004 | -1.69 |
| 0.548000000000004 | -1.665 |
| 0.552000000000004 | -1.641 |
| 0.556000000000004 | -1.617 |
| 0.560000000000004 | -1.594 |
| 0.564000000000004 | -1.572 |
| 0.568000000000004 | -1.55 |
| 0.572000000000004 | -1.528 |
| 0.576000000000004 | -1.507 |
| 0.580000000000004 | -1.486 |
| 0.584000000000004 | -1.466 |
| 0.588000000000004 | -1.446 |
| 0.592000000000004 | -1.427 |
| 0.596000000000004 | -1.408 |
| 0.600000000000004 | -1.389 |
| 0.604000000000004 | -1.371 |
| 0.608000000000004 | -1.353 |
| 0.612000000000004 | -1.335 |
| 0.616000000000004 | -1.318 |
| 0.620000000000004 | -1.301 |
| 0.624000000000004 | -1.284 |
| 0.628000000000004 | -1.268 |
| 0.632000000000004 | -1.252 |
| 0.636000000000004 | -1.236 |
| 0.640000000000004 | -1.221 |
| 0.644000000000004 | -1.206 |
| 0.648000000000004 | -1.191 |
| 0.652000000000004 | -1.176 |
| 0.656000000000004 | -1.162 |
| 0.660000000000004 | -1.148 |
| 0.664000000000004 | -1.134 |
| 0.668000000000004 | -1.121 |
| 0.672000000000004 | -1.107 |
| 0.676000000000004 | -1.094 |
| 0.680000000000004 | -1.081 |
| 0.684000000000004 | -1.069 |
| 0.688000000000004 | -1.056 |
| 0.692000000000004 | -1.044 |
| 0.696000000000004 | -1.032 |
| 0.700000000000004 | -1.02 |
| 0.704000000000004 | -1.009 |
| 0.708000000000004 | -0.997 |
| 0.712000000000004 | -0.986 |
| 0.716000000000004 | -0.975 |
| 0.720000000000004 | -0.965 |
| 0.724000000000004 | -0.954 |
| 0.728000000000004 | -0.943 |
| 0.732000000000004 | -0.933 |
| 0.736000000000004 | -0.923 |
| 0.740000000000004 | -0.913 |
| 0.744000000000004 | -0.903 |
| 0.748000000000004 | -0.894 |
| 0.752000000000004 | -0.884 |
| 0.756000000000004 | -0.875 |
| 0.760000000000004 | -0.866 |
| 0.764000000000004 | -0.857 |
| 0.768000000000004 | -0.848 |
| 0.772000000000004 | -0.839 |
| 0.776000000000004 | -0.83 |
| 0.780000000000004 | -0.822 |
| 0.784000000000004 | -0.813 |
| 0.788000000000004 | -0.805 |
| 0.792000000000004 | -0.797 |
| 0.796000000000004 | -0.789 |
| 0.800000000000004 | -0.781 |
| 0.804000000000004 | -0.773 |
| 0.808000000000004 | -0.766 |
| 0.812000000000004 | -0.758 |
| 0.816000000000004 | -0.751 |
| 0.820000000000004 | -0.744 |
| 0.824000000000004 | -0.736 |
| 0.828000000000004 | -0.729 |
| 0.832000000000004 | -0.722 |
| 0.836000000000004 | -0.715 |
| 0.840000000000004 | -0.709 |
| 0.844000000000004 | -0.702 |
| 0.848000000000004 | -0.695 |
| 0.852000000000004 | -0.689 |
| 0.856000000000004 | -0.682 |
| 0.860000000000004 | -0.676 |
| 0.864000000000004 | -0.67 |
| 0.868000000000004 | -0.664 |
| 0.872000000000004 | -0.658 |
| 0.876000000000004 | -0.652 |
| 0.880000000000004 | -0.646 |
| 0.884000000000004 | -0.64 |
| 0.888000000000004 | -0.634 |
| 0.892000000000004 | -0.628 |
| 0.896000000000004 | -0.623 |
| 0.900000000000004 | -0.617 |
| 0.904000000000004 | -0.612 |
| 0.908000000000004 | -0.606 |
| 0.912000000000004 | -0.601 |
| 0.916000000000004 | -0.596 |
| 0.920000000000004 | -0.591 |
| 0.924000000000004 | -0.586 |
| 0.928000000000004 | -0.581 |
| 0.932000000000004 | -0.576 |
| 0.936000000000004 | -0.571 |
| 0.940000000000004 | -0.566 |
| 0.944000000000004 | -0.561 |
| 0.948000000000004 | -0.556 |
| 0.952000000000004 | -0.552 |
| 0.956000000000004 | -0.547 |
| 0.960000000000004 | -0.543 |
| 0.964000000000004 | -0.538 |
| 0.968000000000004 | -0.534 |
| 0.972000000000004 | -0.529 |
| 0.976000000000004 | -0.525 |
| 0.980000000000004 | -0.521 |
| 0.984000000000004 | -0.516 |
| 0.988000000000004 | -0.512 |
| 0.992000000000004 | -0.508 |
| 0.996000000000004 | -0.504 |
| 1.000000000000004 | -0.5 |
| 1.004000000000004 | -0.496 |
| 1.008000000000004 | -0.492 |
| 1.012000000000004 | -0.488 |
| 1.016000000000004 | -0.484 |
| 1.020000000000004 | -0.481 |
| 1.024000000000004 | -0.477 |
| 1.028000000000004 | -0.473 |
| 1.032000000000004 | -0.469 |
| 1.036000000000004 | -0.466 |
| 1.040000000000004 | -0.462 |
| 1.044000000000004 | -0.459 |
| 1.048000000000004 | -0.455 |
| 1.052000000000004 | -0.452 |
| 1.056000000000004 | -0.448 |
| 1.060000000000004 | -0.445 |
| 1.064000000000004 | -0.442 |
| 1.068000000000004 | -0.438 |
| 1.072000000000004 | -0.435 |
| 1.076000000000004 | -0.432 |
| 1.080000000000004 | -0.429 |
| 1.084000000000004 | -0.426 |
| 1.088000000000004 | -0.422 |
| 1.092000000000004 | -0.419 |
| 1.096000000000004 | -0.416 |
| 1.100000000000004 | -0.413 |
| 1.104000000000004 | -0.41 |
| 1.108000000000004 | -0.407 |
| 1.112000000000004 | -0.404 |
| 1.116000000000004 | -0.401 |
| 1.120000000000004 | -0.399 |
| 1.124000000000004 | -0.396 |
| 1.128000000000004 | -0.393 |
| 1.132000000000004 | -0.39 |
| 1.136000000000004 | -0.387 |
| 1.140000000000004 | -0.385 |
| 1.144000000000004 | -0.382 |
| 1.148000000000004 | -0.379 |
| 1.152000000000004 | -0.377 |
| 1.156000000000004 | -0.374 |
| 1.160000000000004 | -0.372 |
| 1.164000000000004 | -0.369 |
| 1.168000000000004 | -0.367 |
| 1.172000000000004 | -0.364 |
| 1.176000000000004 | -0.362 |
| 1.180000000000004 | -0.359 |
| 1.184000000000004 | -0.357 |
| 1.188000000000004 | -0.354 |
| 1.192000000000004 | -0.352 |
| 1.196000000000004 | -0.35 |
| 1.200000000000004 | -0.347 |
| 1.204000000000004 | -0.345 |
| 1.208000000000004 | -0.343 |
| 1.212000000000004 | -0.34 |
| 1.216000000000004 | -0.338 |
| 1.220000000000004 | -0.336 |
| 1.224000000000004 | -0.334 |
| 1.228000000000004 | -0.332 |
| 1.232000000000004 | -0.329 |
| 1.236000000000004 | -0.327 |
| 1.240000000000004 | -0.325 |
| 1.244000000000004 | -0.323 |
| 1.248000000000004 | -0.321 |
| 1.252000000000004 | -0.319 |
| 1.256000000000004 | -0.317 |
| 1.260000000000004 | -0.315 |
| 1.264000000000004 | -0.313 |
| 1.268000000000004 | -0.311 |
| 1.272000000000004 | -0.309 |
| 1.276000000000004 | -0.307 |
| 1.280000000000004 | -0.305 |
| 1.284000000000004 | -0.303 |
| 1.288000000000004 | -0.301 |
| 1.292000000000004 | -0.3 |
| 1.296000000000004 | -0.298 |
| 1.300000000000004 | -0.296 |
| 1.304000000000004 | -0.294 |
| 1.308000000000004 | -0.292 |
| 1.312000000000004 | -0.29 |
| 1.316000000000004 | -0.289 |
| 1.320000000000004 | -0.287 |
| 1.324000000000004 | -0.285 |
| 1.328000000000004 | -0.284 |
| 1.332000000000004 | -0.282 |
| 1.336000000000004 | -0.28 |
| 1.340000000000004 | -0.278 |
| 1.344000000000004 | -0.277 |
| 1.348000000000004 | -0.275 |
| 1.352000000000004 | -0.274 |
| 1.356000000000004 | -0.272 |
| 1.360000000000004 | -0.27 |
| 1.364000000000004 | -0.269 |
| 1.368000000000004 | -0.267 |
| 1.372000000000004 | -0.266 |
| 1.376000000000004 | -0.264 |
| 1.380000000000004 | -0.263 |
| 1.384000000000004 | -0.261 |
| 1.388000000000005 | -0.26 |
| 1.392000000000004 | -0.258 |
| 1.396000000000004 | -0.257 |
| 1.400000000000005 | -0.255 |
| 1.404000000000005 | -0.254 |
| 1.408000000000005 | -0.252 |
| 1.412000000000005 | -0.251 |
| 1.416000000000005 | -0.249 |
| 1.420000000000005 | -0.248 |
| 1.424000000000005 | -0.247 |
| 1.428000000000005 | -0.245 |
| 1.432000000000005 | -0.244 |
| 1.436000000000005 | -0.242 |
| 1.440000000000005 | -0.241 |
| 1.444000000000005 | -0.24 |
| 1.448000000000005 | -0.238 |
| 1.452000000000005 | -0.237 |
| 1.456000000000005 | -0.236 |
| 1.460000000000005 | -0.235 |
| 1.464000000000005 | -0.233 |
| 1.468000000000005 | -0.232 |
| 1.472000000000005 | -0.231 |
| 1.476000000000005 | -0.23 |
| 1.480000000000005 | -0.228 |
| 1.484000000000005 | -0.227 |
| 1.488000000000005 | -0.226 |
| 1.492000000000005 | -0.225 |
| 1.496000000000005 | -0.223 |
| 1.500000000000005 | -0.222 |
| 1.504000000000005 | -0.221 |
| 1.508000000000005 | -0.22 |
| 1.512000000000005 | -0.219 |
| 1.516000000000005 | -0.218 |
| 1.520000000000005 | -0.216 |
| 1.524000000000005 | -0.215 |
| 1.528000000000005 | -0.214 |
| 1.532000000000005 | -0.213 |
| 1.536000000000005 | -0.212 |
| 1.540000000000005 | -0.211 |
| 1.544000000000005 | -0.21 |
| 1.548000000000005 | -0.209 |
| 1.552000000000005 | -0.208 |
| 1.556000000000005 | -0.207 |
| 1.560000000000005 | -0.205 |
| 1.564000000000005 | -0.204 |
| 1.568000000000005 | -0.203 |
| 1.572000000000005 | -0.202 |
| 1.576000000000005 | -0.201 |
| 1.580000000000005 | -0.2 |
| 1.584000000000005 | -0.199 |
| 1.588000000000005 | -0.198 |
| 1.592000000000005 | -0.197 |
| 1.596000000000005 | -0.196 |
| 1.600000000000005 | -0.195 |
| 1.604000000000005 | -0.194 |
| 1.608000000000005 | -0.193 |
| 1.612000000000005 | -0.192 |
| 1.616000000000005 | -0.191 |
| 1.620000000000005 | -0.191 |
| 1.624000000000005 | -0.19 |
| 1.628000000000005 | -0.189 |
| 1.632000000000005 | -0.188 |
| 1.636000000000005 | -0.187 |
| 1.640000000000005 | -0.186 |
| 1.644000000000005 | -0.185 |
| 1.648000000000005 | -0.184 |
| 1.652000000000005 | -0.183 |
| 1.656000000000005 | -0.182 |
| 1.660000000000005 | -0.181 |
| 1.664000000000005 | -0.181 |
| 1.668000000000005 | -0.18 |
| 1.672000000000005 | -0.179 |
| 1.676000000000005 | -0.178 |
| 1.680000000000005 | -0.177 |
| 1.684000000000005 | -0.176 |
| 1.688000000000005 | -0.175 |
| 1.692000000000005 | -0.175 |
| 1.696000000000005 | -0.174 |
| 1.700000000000005 | -0.173 |
| 1.704000000000005 | -0.172 |
| 1.708000000000005 | -0.171 |
| 1.712000000000005 | -0.171 |
| 1.716000000000005 | -0.17 |
| 1.720000000000005 | -0.169 |
| 1.724000000000005 | -0.168 |
| 1.728000000000005 | -0.167 |
| 1.732000000000005 | -0.167 |
| 1.736000000000005 | -0.166 |
| 1.740000000000005 | -0.165 |
| 1.744000000000005 | -0.164 |
| 1.748000000000005 | -0.164 |
| 1.752000000000005 | -0.163 |
| 1.756000000000005 | -0.162 |
| 1.760000000000005 | -0.161 |
| 1.764000000000005 | -0.161 |
| 1.768000000000005 | -0.16 |
| 1.772000000000005 | -0.159 |
| 1.776000000000005 | -0.159 |
| 1.780000000000005 | -0.158 |
| 1.784000000000005 | -0.157 |
| 1.788000000000005 | -0.156 |
| 1.792000000000005 | -0.156 |
| 1.796000000000005 | -0.155 |
| 1.800000000000005 | -0.154 |
| 1.804000000000005 | -0.154 |
| 1.808000000000005 | -0.153 |
| 1.812000000000005 | -0.152 |
| 1.816000000000005 | -0.152 |
| 1.820000000000005 | -0.151 |
| 1.824000000000005 | -0.15 |
| 1.828000000000005 | -0.15 |
| 1.832000000000005 | -0.149 |
| 1.836000000000005 | -0.148 |
| 1.840000000000005 | -0.148 |
| 1.844000000000005 | -0.147 |
| 1.848000000000005 | -0.146 |
| 1.852000000000005 | -0.146 |
| 1.856000000000005 | -0.145 |
| 1.860000000000005 | -0.145 |
| 1.864000000000005 | -0.144 |
| 1.868000000000005 | -0.143 |
| 1.872000000000005 | -0.143 |
| 1.876000000000005 | -0.142 |
| 1.880000000000005 | -0.141 |
| 1.884000000000005 | -0.141 |
| 1.888000000000005 | -0.14 |
| 1.892000000000005 | -0.14 |
| 1.896000000000005 | -0.139 |
| 1.900000000000005 | -0.139 |
| 1.904000000000005 | -0.138 |
| 1.908000000000005 | -0.137 |
| 1.912000000000005 | -0.137 |
| 1.916000000000005 | -0.136 |
| 1.920000000000005 | -0.136 |
| 1.924000000000005 | -0.135 |
| 1.928000000000005 | -0.135 |
| 1.932000000000005 | -0.134 |
| 1.936000000000005 | -0.133 |
| 1.940000000000005 | -0.133 |
| 1.944000000000005 | -0.132 |
| 1.948000000000005 | -0.132 |
| 1.952000000000005 | -0.131 |
| 1.956000000000005 | -0.131 |
| 1.960000000000005 | -0.13 |
| 1.964000000000005 | -0.13 |
| 1.968000000000005 | -0.129 |
| 1.972000000000005 | -0.129 |
| 1.976000000000005 | -0.128 |
| 1.980000000000005 | -0.128 |
| 1.984000000000005 | -0.127 |
| 1.988000000000005 | -0.127 |
| 1.992000000000005 | -0.126 |
| 1.996000000000005 | -0.126 |
| 2.000000000000005 | -0.125 |
| 2.004000000000005 | -0.125 |
| 2.008000000000005 | -0.124 |
| 2.012000000000005 | -0.124 |
| 2.016000000000005 | -0.123 |
| 2.020000000000005 | -0.123 |
| 2.024000000000005 | -0.122 |
| 2.028000000000005 | -0.122 |
| 2.032000000000005 | -0.121 |
| 2.036000000000005 | -0.121 |
| 2.040000000000005 | -0.12 |
| 2.044000000000005 | -0.12 |
| 2.048000000000005 | -0.119 |
| 2.052000000000005 | -0.119 |
| 2.056000000000005 | -0.118 |
| 2.060000000000005 | -0.118 |
| 2.064000000000005 | -0.117 |
| 2.068000000000005 | -0.117 |
| 2.072000000000005 | -0.116 |
| 2.076000000000005 | -0.116 |
| 2.080000000000005 | -0.116 |
| 2.084000000000005 | -0.115 |
| 2.088000000000005 | -0.115 |
| 2.092000000000005 | -0.114 |
| 2.096000000000005 | -0.114 |
| 2.100000000000005 | -0.113 |
| 2.104000000000005 | -0.113 |
| 2.108000000000005 | -0.113 |
| 2.112000000000005 | -0.112 |
| 2.116000000000005 | -0.112 |
| 2.120000000000005 | -0.111 |
| 2.124000000000005 | -0.111 |
| 2.128000000000005 | -0.11 |
| 2.132000000000005 | -0.11 |
| 2.136000000000005 | -0.11 |
| 2.140000000000005 | -0.109 |
| 2.144000000000005 | -0.109 |
| 2.148000000000005 | -0.108 |
| 2.152000000000005 | -0.108 |
| 2.156000000000005 | -0.108 |
| 2.160000000000005 | -0.107 |
| 2.164000000000005 | -0.107 |
| 2.168000000000005 | -0.106 |
| 2.172000000000005 | -0.106 |
| 2.176000000000005 | -0.106 |
| 2.180000000000005 | -0.105 |
| 2.184000000000005 | -0.105 |
| 2.188000000000005 | -0.104 |
| 2.192000000000005 | -0.104 |
| 2.196000000000005 | -0.104 |
| 2.200000000000005 | -0.103 |
| 2.204000000000005 | -0.103 |
| 2.208000000000005 | -0.103 |
| 2.212000000000005 | -0.102 |
| 2.216000000000005 | -0.102 |
| 2.220000000000005 | -0.101 |
| 2.224000000000005 | -0.101 |
| 2.228000000000005 | -0.101 |
| 2.232000000000005 | -0.1 |
| 2.236000000000005 | -0.1 |
| 2.240000000000005 | -0.1 |
| 2.244000000000005 | -0.099 |
| 2.248000000000005 | -0.099 |
| 2.252000000000005 | -0.099 |
| 2.256000000000005 | -0.098 |
| 2.260000000000005 | -0.098 |
| 2.264000000000005 | -0.098 |
| 2.268000000000005 | -0.097 |
| 2.272000000000005 | -0.097 |
| 2.276000000000005 | -0.097 |
| 2.280000000000005 | -0.096 |
| 2.284000000000005 | -0.096 |
| 2.288000000000005 | -0.096 |
| 2.292000000000005 | -0.095 |
| 2.296000000000005 | -0.095 |
| 2.300000000000005 | -0.095 |
| 2.304000000000005 | -0.094 |
| 2.308000000000005 | -0.094 |
| 2.312000000000005 | -0.094 |
| 2.316000000000005 | -0.093 |
| 2.320000000000005 | -0.093 |
| 2.324000000000005 | -0.093 |
| 2.328000000000005 | -0.092 |
| 2.332000000000005 | -0.092 |
| 2.336000000000005 | -0.092 |
| 2.340000000000005 | -0.091 |
| 2.344000000000005 | -0.091 |
| 2.348000000000005 | -0.091 |
| 2.352000000000005 | -0.09 |
| 2.356000000000005 | -0.09 |
| 2.360000000000005 | -0.09 |
| 2.364000000000005 | -0.089 |
| 2.368000000000005 | -0.089 |
| 2.372000000000005 | -0.089 |
| 2.376000000000005 | -0.089 |
| 2.380000000000005 | -0.088 |
| 2.384000000000005 | -0.088 |
| 2.388000000000005 | -0.088 |
| 2.392000000000005 | -0.087 |
| 2.396000000000005 | -0.087 |
| 2.400000000000005 | -0.087 |
| 2.404000000000005 | -0.087 |
| 2.408000000000005 | -0.086 |
| 2.412000000000005 | -0.086 |
| 2.416000000000005 | -0.086 |
| 2.420000000000005 | -0.085 |
| 2.424000000000005 | -0.085 |
| 2.428000000000005 | -0.085 |
| 2.432000000000005 | -0.085 |
| 2.436000000000005 | -0.084 |
| 2.440000000000005 | -0.084 |
| 2.444000000000005 | -0.084 |
| 2.448000000000005 | -0.083 |
| 2.452000000000005 | -0.083 |
| 2.456000000000005 | -0.083 |
| 2.460000000000005 | -0.083 |
| 2.464000000000005 | -0.082 |
| 2.468000000000005 | -0.082 |
| 2.472000000000005 | -0.082 |
| 2.476000000000005 | -0.082 |
| 2.480000000000005 | -0.081 |
| 2.484000000000005 | -0.081 |
| 2.488000000000005 | -0.081 |
| 2.492000000000005 | -0.081 |
| 2.496000000000005 | -0.08 |
| 2.500000000000005 | -0.08 |
| 2.504000000000005 | -0.08 |
| 2.508000000000005 | -0.079 |
| 2.512000000000005 | -0.079 |
| 2.516000000000005 | -0.079 |
| 2.520000000000005 | -0.079 |
| 2.524000000000005 | -0.078 |
| 2.528000000000005 | -0.078 |
| 2.532000000000005 | -0.078 |
| 2.536000000000005 | -0.078 |
| 2.540000000000005 | -0.078 |
| 2.544000000000005 | -0.077 |
| 2.548000000000005 | -0.077 |
| 2.552000000000005 | -0.077 |
| 2.556000000000005 | -0.077 |
| 2.560000000000005 | -0.076 |
| 2.564000000000005 | -0.076 |
| 2.568000000000005 | -0.076 |
| 2.572000000000005 | -0.076 |
| 2.576000000000005 | -0.075 |
| 2.580000000000005 | -0.075 |
| 2.584000000000005 | -0.075 |
| 2.588000000000005 | -0.075 |
| 2.592000000000005 | -0.074 |
| 2.596000000000005 | -0.074 |
| 2.600000000000005 | -0.074 |
| 2.604000000000005 | -0.074 |
| 2.608000000000005 | -0.074 |
| 2.612000000000005 | -0.073 |
| 2.616000000000005 | -0.073 |
| 2.620000000000005 | -0.073 |
| 2.624000000000005 | -0.073 |
| 2.628000000000005 | -0.072 |
| 2.632000000000005 | -0.072 |
| 2.636000000000005 | -0.072 |
| 2.640000000000005 | -0.072 |
| 2.644000000000005 | -0.072 |
| 2.648000000000005 | -0.071 |
| 2.652000000000005 | -0.071 |
| 2.656000000000005 | -0.071 |
| 2.660000000000005 | -0.071 |
| 2.664000000000005 | -0.07 |
| 2.668000000000005 | -0.07 |
| 2.672000000000005 | -0.07 |
| 2.676000000000005 | -0.07 |
| 2.680000000000005 | -0.07 |
| 2.684000000000005 | -0.069 |
| 2.688000000000005 | -0.069 |
| 2.692000000000005 | -0.069 |
| 2.696000000000005 | -0.069 |
| 2.700000000000005 | -0.069 |
| 2.704000000000005 | -0.068 |
| 2.708000000000005 | -0.068 |
| 2.712000000000005 | -0.068 |
| 2.716000000000005 | -0.068 |
| 2.720000000000005 | -0.068 |
| 2.724000000000005 | -0.067 |
| 2.728000000000005 | -0.067 |
| 2.732000000000005 | -0.067 |
| 2.736000000000005 | -0.067 |
| 2.740000000000005 | -0.067 |
| 2.744000000000005 | -0.066 |
| 2.748000000000005 | -0.066 |
| 2.752000000000005 | -0.066 |
| 2.756000000000005 | -0.066 |
| 2.760000000000005 | -0.066 |
| 2.764000000000005 | -0.065 |
| 2.768000000000005 | -0.065 |
| 2.772000000000005 | -0.065 |
| 2.776000000000005 | -0.065 |
| 2.780000000000005 | -0.065 |
| 2.784000000000005 | -0.065 |
| 2.788000000000006 | -0.064 |
| 2.792000000000005 | -0.064 |
| 2.796000000000005 | -0.064 |
| 2.800000000000006 | -0.064 |
| 2.804000000000006 | -0.064 |
| 2.808000000000006 | -0.063 |
| 2.812000000000006 | -0.063 |
| 2.816000000000006 | -0.063 |
| 2.820000000000006 | -0.063 |
| 2.824000000000006 | -0.063 |
| 2.828000000000006 | -0.063 |
| 2.832000000000006 | -0.062 |
| 2.836000000000006 | -0.062 |
| 2.840000000000006 | -0.062 |
| 2.844000000000006 | -0.062 |
| 2.848000000000006 | -0.062 |
| 2.852000000000006 | -0.061 |
| 2.856000000000006 | -0.061 |
| 2.860000000000006 | -0.061 |
| 2.864000000000006 | -0.061 |
| 2.868000000000006 | -0.061 |
| 2.872000000000006 | -0.061 |
| 2.876000000000006 | -0.06 |
| 2.880000000000006 | -0.06 |
| 2.884000000000006 | -0.06 |
| 2.888000000000006 | -0.06 |
| 2.892000000000006 | -0.06 |
| 2.896000000000006 | -0.06 |
| 2.900000000000006 | -0.059 |
| 2.904000000000006 | -0.059 |
| 2.908000000000006 | -0.059 |
| 2.912000000000006 | -0.059 |
| 2.916000000000006 | -0.059 |
| 2.920000000000006 | -0.059 |
| 2.924000000000006 | -0.058 |
| 2.928000000000006 | -0.058 |
| 2.932000000000006 | -0.058 |
| 2.936000000000006 | -0.058 |
| 2.940000000000006 | -0.058 |
| 2.944000000000006 | -0.058 |
| 2.948000000000006 | -0.058 |
| 2.952000000000006 | -0.057 |
| 2.956000000000006 | -0.057 |
| 2.960000000000006 | -0.057 |
| 2.964000000000006 | -0.057 |
| 2.968000000000006 | -0.057 |
| 2.972000000000006 | -0.057 |
| 2.976000000000006 | -0.056 |
| 2.980000000000006 | -0.056 |
| 2.984000000000006 | -0.056 |
| 2.988000000000006 | -0.056 |
| 2.992000000000006 | -0.056 |
| 2.996000000000006 | -0.056 |
| 3.000000000000006 | -0.056 |
| 3.004000000000006 | -0.055 |
| 3.008000000000006 | -0.055 |
| 3.012000000000006 | -0.055 |
| 3.016000000000006 | -0.055 |
| 3.020000000000006 | -0.055 |
| 3.024000000000006 | -0.055 |
| 3.028000000000006 | -0.055 |
| 3.032000000000006 | -0.054 |
| 3.036000000000006 | -0.054 |
| 3.040000000000006 | -0.054 |
| 3.044000000000006 | -0.054 |
| 3.048000000000006 | -0.054 |
| 3.052000000000006 | -0.054 |
| 3.056000000000006 | -0.054 |
| 3.060000000000006 | -0.053 |
| 3.064000000000006 | -0.053 |
| 3.068000000000006 | -0.053 |
| 3.072000000000006 | -0.053 |
| 3.076000000000006 | -0.053 |
| 3.080000000000006 | -0.053 |
| 3.084000000000006 | -0.053 |
| 3.088000000000006 | -0.052 |
| 3.092000000000006 | -0.052 |
| 3.096000000000006 | -0.052 |
| 3.100000000000006 | -0.052 |
| 3.104000000000006 | -0.052 |
| 3.108000000000006 | -0.052 |
| 3.112000000000006 | -0.052 |
| 3.116000000000006 | -0.051 |
| 3.120000000000006 | -0.051 |
| 3.124000000000006 | -0.051 |
| 3.128000000000006 | -0.051 |
| 3.132000000000006 | -0.051 |
| 3.136000000000006 | -0.051 |
| 3.140000000000006 | -0.051 |
| 3.144000000000006 | -0.051 |
| 3.148000000000006 | -0.05 |
| 3.152000000000006 | -0.05 |
| 3.156000000000006 | -0.05 |
| 3.160000000000006 | -0.05 |
| 3.164000000000006 | -0.05 |
| 3.168000000000006 | -0.05 |
| 3.172000000000006 | -0.05 |
| 3.176000000000006 | -0.05 |
| 3.180000000000006 | -0.049 |
| 3.184000000000006 | -0.049 |
| 3.188000000000006 | -0.049 |
| 3.192000000000006 | -0.049 |
| 3.196000000000006 | -0.049 |
| 3.200000000000006 | -0.049 |
| 3.204000000000006 | -0.049 |
| 3.208000000000006 | -0.049 |
| 3.212000000000006 | -0.048 |
| 3.216000000000006 | -0.048 |
| 3.220000000000006 | -0.048 |
| 3.224000000000006 | -0.048 |
| 3.228000000000006 | -0.048 |
| 3.232000000000006 | -0.048 |
| 3.236000000000006 | -0.048 |
| 3.240000000000006 | -0.048 |
| 3.244000000000006 | -0.048 |
| 3.248000000000006 | -0.047 |
| 3.252000000000006 | -0.047 |
| 3.256000000000006 | -0.047 |
| 3.260000000000006 | -0.047 |
| 3.264000000000006 | -0.047 |
| 3.268000000000006 | -0.047 |
| 3.272000000000006 | -0.047 |
| 3.276000000000006 | -0.047 |
| 3.280000000000006 | -0.046 |
| 3.284000000000006 | -0.046 |
| 3.288000000000006 | -0.046 |
| 3.292000000000006 | -0.046 |
| 3.296000000000006 | -0.046 |
| 3.300000000000006 | -0.046 |
| 3.304000000000006 | -0.046 |
| 3.308000000000006 | -0.046 |
| 3.312000000000006 | -0.046 |
| 3.316000000000006 | -0.045 |
| 3.320000000000006 | -0.045 |
| 3.324000000000006 | -0.045 |
| 3.328000000000006 | -0.045 |
| 3.332000000000006 | -0.045 |
| 3.336000000000006 | -0.045 |
| 3.340000000000006 | -0.045 |
| 3.344000000000006 | -0.045 |
| 3.348000000000006 | -0.045 |
| 3.352000000000006 | -0.045 |
| 3.356000000000006 | -0.044 |
| 3.360000000000006 | -0.044 |
| 3.364000000000006 | -0.044 |
| 3.368000000000006 | -0.044 |
| 3.372000000000006 | -0.044 |
| 3.376000000000006 | -0.044 |
| 3.380000000000006 | -0.044 |
| 3.384000000000006 | -0.044 |
| 3.388000000000006 | -0.044 |
| 3.392000000000006 | -0.043 |
| 3.396000000000006 | -0.043 |
| 3.400000000000006 | -0.043 |
| 3.404000000000006 | -0.043 |
| 3.408000000000006 | -0.043 |
| 3.412000000000006 | -0.043 |
| 3.416000000000006 | -0.043 |
| 3.420000000000006 | -0.043 |
| 3.424000000000006 | -0.043 |
| 3.428000000000006 | -0.043 |
| 3.432000000000006 | -0.042 |
| 3.436000000000006 | -0.042 |
| 3.440000000000006 | -0.042 |
| 3.444000000000006 | -0.042 |
| 3.448000000000006 | -0.042 |
| 3.452000000000006 | -0.042 |
| 3.456000000000006 | -0.042 |
| 3.460000000000006 | -0.042 |
| 3.464000000000006 | -0.042 |
| 3.468000000000006 | -0.042 |
| 3.472000000000006 | -0.041 |
| 3.476000000000006 | -0.041 |
| 3.480000000000006 | -0.041 |
| 3.484000000000006 | -0.041 |
| 3.488000000000006 | -0.041 |
| 3.492000000000006 | -0.041 |
| 3.496000000000006 | -0.041 |
| 3.500000000000006 | -0.041 |
| 3.504000000000006 | -0.041 |
| 3.508000000000006 | -0.041 |
| 3.512000000000006 | -0.041 |
| 3.516000000000006 | -0.04 |
| 3.520000000000006 | -0.04 |
| 3.524000000000006 | -0.04 |
| 3.528000000000006 | -0.04 |
| 3.532000000000006 | -0.04 |
| 3.536000000000006 | -0.04 |
| 3.540000000000006 | -0.04 |
| 3.544000000000006 | -0.04 |
| 3.548000000000006 | -0.04 |
| 3.552000000000006 | -0.04 |
| 3.556000000000006 | -0.04 |
| 3.560000000000006 | -0.039 |
| 3.564000000000006 | -0.039 |
| 3.568000000000006 | -0.039 |
| 3.572000000000006 | -0.039 |
| 3.576000000000006 | -0.039 |
| 3.580000000000006 | -0.039 |
| 3.584000000000006 | -0.039 |
| 3.588000000000006 | -0.039 |
| 3.592000000000006 | -0.039 |
| 3.596000000000006 | -0.039 |
| 3.600000000000006 | -0.039 |
| 3.604000000000006 | -0.038 |
| 3.608000000000006 | -0.038 |
| 3.612000000000006 | -0.038 |
| 3.616000000000006 | -0.038 |
| 3.620000000000006 | -0.038 |
| 3.624000000000006 | -0.038 |
| 3.628000000000006 | -0.038 |
| 3.632000000000006 | -0.038 |
| 3.636000000000006 | -0.038 |
| 3.640000000000006 | -0.038 |
| 3.644000000000006 | -0.038 |
| 3.648000000000006 | -0.038 |
| 3.652000000000006 | -0.037 |
| 3.656000000000006 | -0.037 |
| 3.660000000000006 | -0.037 |
| 3.664000000000006 | -0.037 |
| 3.668000000000006 | -0.037 |
| 3.672000000000006 | -0.037 |
| 3.676000000000006 | -0.037 |
| 3.680000000000006 | -0.037 |
| 3.684000000000006 | -0.037 |
| 3.688000000000006 | -0.037 |
| 3.692000000000006 | -0.037 |
| 3.696000000000006 | -0.037 |
| 3.700000000000006 | -0.037 |
| 3.704000000000006 | -0.036 |
| 3.708000000000006 | -0.036 |
| 3.712000000000006 | -0.036 |
| 3.716000000000006 | -0.036 |
| 3.720000000000006 | -0.036 |
| 3.724000000000006 | -0.036 |
| 3.728000000000006 | -0.036 |
| 3.732000000000006 | -0.036 |
| 3.736000000000006 | -0.036 |
| 3.740000000000006 | -0.036 |
| 3.744000000000006 | -0.036 |
| 3.748000000000006 | -0.036 |
| 3.752000000000006 | -0.036 |
| 3.756000000000006 | -0.035 |
| 3.760000000000006 | -0.035 |
| 3.764000000000006 | -0.035 |
| 3.768000000000006 | -0.035 |
| 3.772000000000006 | -0.035 |
| 3.776000000000006 | -0.035 |
| 3.780000000000006 | -0.035 |
| 3.784000000000006 | -0.035 |
| 3.788000000000006 | -0.035 |
| 3.792000000000006 | -0.035 |
| 3.796000000000006 | -0.035 |
| 3.800000000000006 | -0.035 |
| 3.804000000000006 | -0.035 |
| 3.808000000000006 | -0.034 |
| 3.812000000000006 | -0.034 |
| 3.816000000000006 | -0.034 |
| 3.820000000000006 | -0.034 |
| 3.824000000000006 | -0.034 |
| 3.828000000000006 | -0.034 |
| 3.832000000000006 | -0.034 |
| 3.836000000000006 | -0.034 |
| 3.840000000000006 | -0.034 |
| 3.844000000000006 | -0.034 |
| 3.848000000000006 | -0.034 |
| 3.852000000000006 | -0.034 |
| 3.856000000000006 | -0.034 |
| 3.860000000000006 | -0.034 |
| 3.864000000000006 | -0.033 |
| 3.868000000000006 | -0.033 |
| 3.872000000000006 | -0.033 |
| 3.876000000000006 | -0.033 |
| 3.880000000000006 | -0.033 |
| 3.884000000000006 | -0.033 |
| 3.888000000000007 | -0.033 |
| 3.892000000000006 | -0.033 |
| 3.896000000000006 | -0.033 |
| 3.900000000000007 | -0.033 |
| 3.904000000000007 | -0.033 |
| 3.908000000000007 | -0.033 |
| 3.912000000000007 | -0.033 |
| 3.916000000000007 | -0.033 |
| 3.920000000000007 | -0.033 |
| 3.924000000000007 | -0.032 |
| 3.928000000000007 | -0.032 |
| 3.932000000000007 | -0.032 |
| 3.936000000000007 | -0.032 |
| 3.940000000000007 | -0.032 |
| 3.944000000000007 | -0.032 |
| 3.948000000000007 | -0.032 |
| 3.952000000000007 | -0.032 |
| 3.956000000000007 | -0.032 |
| 3.960000000000007 | -0.032 |
| 3.964000000000007 | -0.032 |
| 3.968000000000007 | -0.032 |
| 3.972000000000007 | -0.032 |
| 3.976000000000007 | -0.032 |
| 3.980000000000007 | -0.032 |
| 3.984000000000007 | -0.032 |
| 3.988000000000007 | -0.031 |
| 3.992000000000007 | -0.031 |
| 3.996000000000007 | -0.031 |
| 4.000000000000006 | -0.031 |